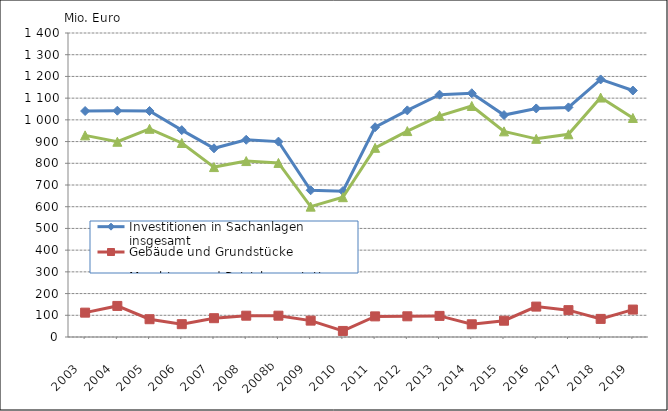
| Category | Investitionen in Sachanlagen insgesamt | Gebäude und Grundstücke | Maschinen und Betriebsausstattung |
|---|---|---|---|
| 2003  | 1040673 | 112131 | 928542 |
| 2004  | 1042199 | 143093 | 899107 |
| 2005  | 1040771 | 81943 | 958828 |
| 2006  | 952585 | 59050 | 893535 |
| 2007  | 869086 | 86618 | 782467 |
| 2008  | 908294 | 98112 | 810182 |
| 2008b | 899839 | 98112 | 801727 |
| 2009  | 675811 | 75418 | 600393 |
| 2010  | 671734.109 | 27895.396 | 643838.713 |
| 2011  | 966215.121 | 94979.882 | 871235.239 |
| 2012  | 1043637.405 | 95334.066 | 948303.339 |
| 2013  | 1115956.006 | 97198.2 | 1018757.806 |
| 2014  | 1122553.349 | 58554.558 | 1063998.791 |
| 2015  | 1022095.197 | 75014.669 | 947080.528 |
| 2016  | 1052570.21 | 139988.972 | 912581.238 |
| 2017  | 1057379.348 | 123665.469 | 933713.879 |
| 2018  | 1186108.837 | 83370.127 | 1102738.71 |
| 2019  | 1135086.868 | 126326.509 | 1008760.359 |